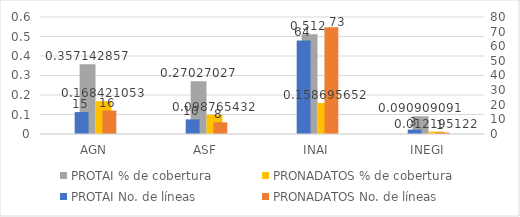
| Category | PROTAI % de cobertura | PRONADATOS % de cobertura |
|---|---|---|
| AGN | 0.357 | 0.168 |
| ASF | 0.27 | 0.099 |
| INAI | 0.512 | 0.159 |
| INEGI | 0.091 | 0.012 |